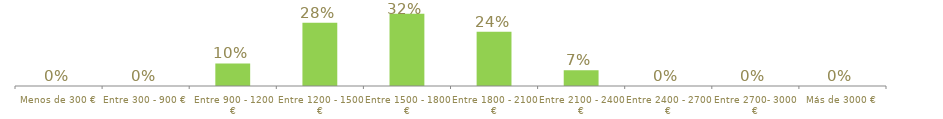
| Category | Series 0 |
|---|---|
| Menos de 300 € | 0 |
| Entre 300 - 900 € | 0 |
| Entre 900 - 1200 € | 0.1 |
| Entre 1200 - 1500 € | 0.28 |
| Entre 1500 - 1800 € | 0.32 |
| Entre 1800 - 2100 € | 0.24 |
| Entre 2100 - 2400 € | 0.07 |
| Entre 2400 - 2700 € | 0 |
| Entre 2700- 3000 € | 0 |
| Más de 3000 € | 0 |